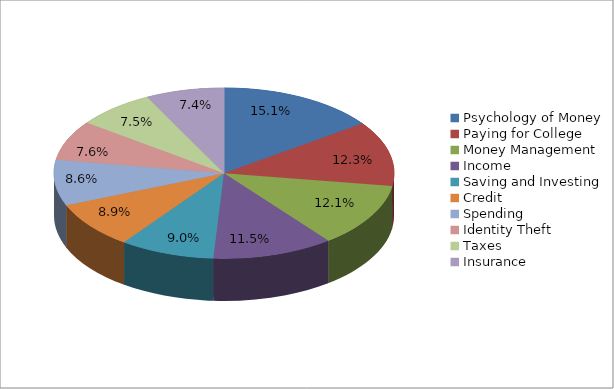
| Category | Series 0 |
|---|---|
| Psychology of Money | 34245 |
| Paying for College | 27857 |
| Money Management | 27457 |
| Income | 26036 |
| Saving and Investing | 20358 |
| Credit | 20118 |
| Spending  | 19595 |
| Identity Theft | 17179 |
| Taxes | 16974 |
| Insurance | 16863 |